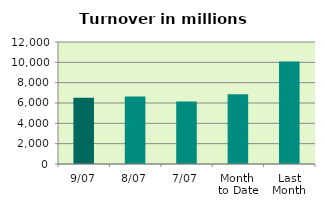
| Category | Series 0 |
|---|---|
| 9/07 | 6525.012 |
| 8/07 | 6644.596 |
| 7/07 | 6151.125 |
| Month 
to Date | 6870.128 |
| Last
Month | 10085.686 |